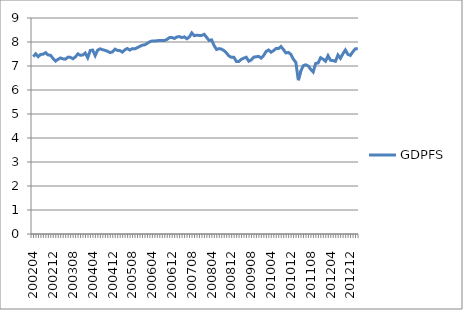
| Category | GDPFS |
|---|---|
| 200204.0 | 7.388 |
| 200205.0 | 7.507 |
| 200206.0 | 7.391 |
| 200207.0 | 7.481 |
| 200208.0 | 7.491 |
| 200209.0 | 7.557 |
| 200210.0 | 7.459 |
| 200211.0 | 7.444 |
| 200212.0 | 7.314 |
| 200301.0 | 7.205 |
| 200302.0 | 7.279 |
| 200303.0 | 7.335 |
| 200304.0 | 7.296 |
| 200305.0 | 7.285 |
| 200306.0 | 7.37 |
| 200307.0 | 7.363 |
| 200308.0 | 7.302 |
| 200309.0 | 7.374 |
| 200310.0 | 7.506 |
| 200311.0 | 7.448 |
| 200312.0 | 7.458 |
| 200401.0 | 7.54 |
| 200402.0 | 7.342 |
| 200403.0 | 7.646 |
| 200404.0 | 7.664 |
| 200405.0 | 7.431 |
| 200406.0 | 7.658 |
| 200407.0 | 7.715 |
| 200408.0 | 7.679 |
| 200409.0 | 7.651 |
| 200410.0 | 7.614 |
| 200411.0 | 7.558 |
| 200412.0 | 7.589 |
| 200501.0 | 7.701 |
| 200502.0 | 7.648 |
| 200503.0 | 7.641 |
| 200504.0 | 7.577 |
| 200505.0 | 7.677 |
| 200506.0 | 7.728 |
| 200507.0 | 7.663 |
| 200508.0 | 7.724 |
| 200509.0 | 7.713 |
| 200510.0 | 7.762 |
| 200511.0 | 7.814 |
| 200512.0 | 7.867 |
| 200601.0 | 7.882 |
| 200602.0 | 7.942 |
| 200603.0 | 8.009 |
| 200604.0 | 8.043 |
| 200605.0 | 8.041 |
| 200606.0 | 8.052 |
| 200607.0 | 8.067 |
| 200608.0 | 8.067 |
| 200609.0 | 8.062 |
| 200610.0 | 8.108 |
| 200611.0 | 8.185 |
| 200612.0 | 8.186 |
| 200701.0 | 8.148 |
| 200702.0 | 8.211 |
| 200703.0 | 8.226 |
| 200704.0 | 8.183 |
| 200705.0 | 8.215 |
| 200706.0 | 8.135 |
| 200707.0 | 8.208 |
| 200708.0 | 8.378 |
| 200709.0 | 8.262 |
| 200710.0 | 8.283 |
| 200711.0 | 8.273 |
| 200712.0 | 8.275 |
| 200801.0 | 8.32 |
| 200802.0 | 8.193 |
| 200803.0 | 8.063 |
| 200804.0 | 8.09 |
| 200805.0 | 7.854 |
| 200806.0 | 7.688 |
| 200807.0 | 7.725 |
| 200808.0 | 7.704 |
| 200809.0 | 7.641 |
| 200810.0 | 7.544 |
| 200811.0 | 7.418 |
| 200812.0 | 7.36 |
| 200901.0 | 7.361 |
| 200902.0 | 7.192 |
| 200903.0 | 7.19 |
| 200904.0 | 7.279 |
| 200905.0 | 7.327 |
| 200906.0 | 7.366 |
| 200907.0 | 7.199 |
| 200908.0 | 7.253 |
| 200909.0 | 7.369 |
| 200910.0 | 7.385 |
| 200911.0 | 7.401 |
| 200912.0 | 7.328 |
| 201001.0 | 7.437 |
| 201002.0 | 7.605 |
| 201003.0 | 7.667 |
| 201004.0 | 7.574 |
| 201005.0 | 7.639 |
| 201006.0 | 7.728 |
| 201007.0 | 7.724 |
| 201008.0 | 7.812 |
| 201009.0 | 7.683 |
| 201010.0 | 7.543 |
| 201011.0 | 7.566 |
| 201012.0 | 7.486 |
| 201101.0 | 7.284 |
| 201102.0 | 7.153 |
| 201103.0 | 6.408 |
| 201104.0 | 6.786 |
| 201105.0 | 7.01 |
| 201106.0 | 7.05 |
| 201107.0 | 7.002 |
| 201108.0 | 6.861 |
| 201109.0 | 6.751 |
| 201110.0 | 7.104 |
| 201111.0 | 7.129 |
| 201112.0 | 7.346 |
| 201201.0 | 7.284 |
| 201202.0 | 7.199 |
| 201203.0 | 7.429 |
| 201204.0 | 7.238 |
| 201205.0 | 7.227 |
| 201206.0 | 7.195 |
| 201207.0 | 7.459 |
| 201208.0 | 7.321 |
| 201209.0 | 7.508 |
| 201210.0 | 7.667 |
| 201211.0 | 7.485 |
| 201212.0 | 7.442 |
| 201301.0 | 7.591 |
| 201302.0 | 7.714 |
| 201303.0 | 7.727 |